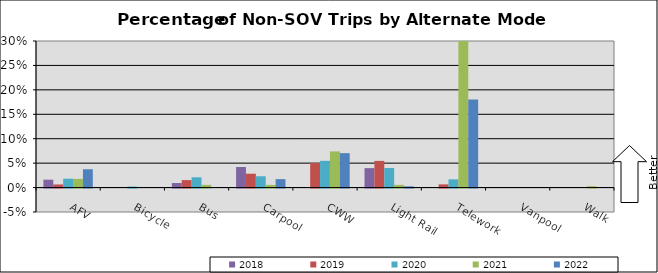
| Category | 2018 | 2019 | 2020 | 2021 | 2022 |
|---|---|---|---|---|---|
| AFV | 0.016 | 0.006 | 0.018 | 0.018 | 0.038 |
| Bicycle | 0 | 0 | 0.002 | 0 | 0 |
| Bus | 0.009 | 0.015 | 0.021 | 0.005 | 0 |
| Carpool | 0.042 | 0.028 | 0.023 | 0.005 | 0.017 |
| CWW | 0 | 0.05 | 0.055 | 0.074 | 0.07 |
| Light Rail | 0.04 | 0.055 | 0.04 | 0.005 | 0.002 |
| Telework | 0 | 0.007 | 0.017 | 0.326 | 0.18 |
| Vanpool | 0 | 0 | 0 | 0 | 0 |
| Walk | 0 | 0 | 0 | 0.003 | 0 |